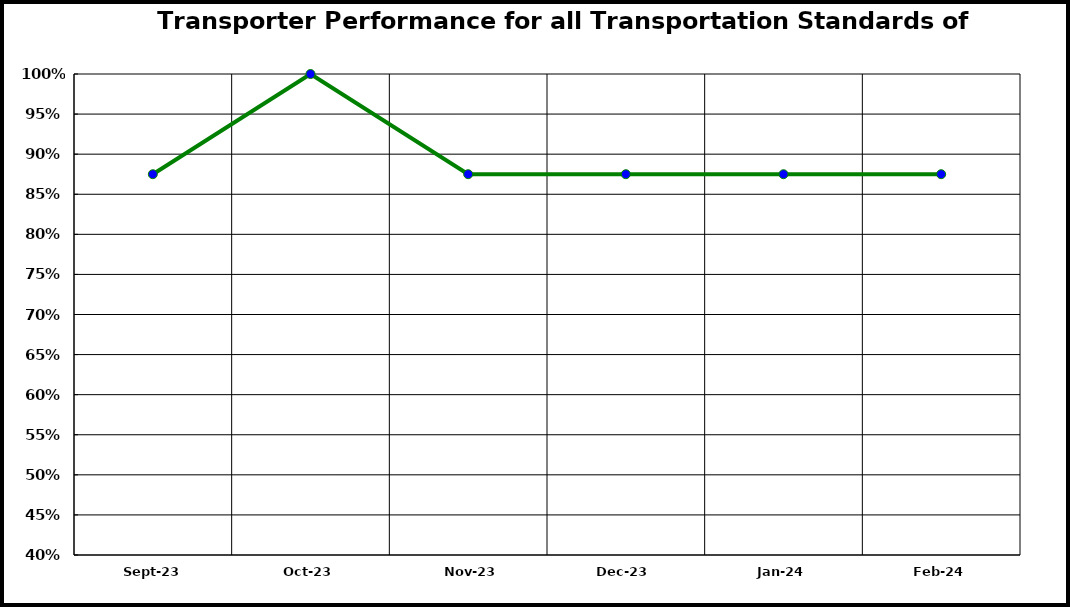
| Category | Performance |
|---|---|
| 2023-09-01 | 0.875 |
| 2023-10-01 | 1 |
| 2023-11-01 | 0.875 |
| 2023-12-01 | 0.875 |
| 2024-01-01 | 0.875 |
| 2024-02-01 | 0.875 |